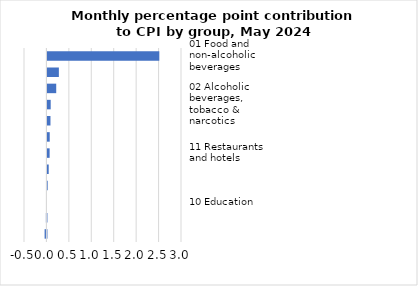
| Category |     Contributions |
|---|---|
| 01 Food and non-alcoholic beverages | 2.494 |
| 07 Transport | 0.255 |
| 05 Furnishings, household equipment & maintenance | 0.196 |
| 02 Alcoholic beverages, tobacco & narcotics | 0.073 |
| 08 Communication | 0.068 |
| 06 Health | 0.051 |
| 11 Restaurants and hotels | 0.049 |
| 09 Recreation and culture | 0.028 |
| 12 Miscellaneous goods & services | 0.006 |
| 10 Education | 0 |
| 03 Clothing and footwear | -0.013 |
| 04 Housing, water, electricity, gas & other fuels | -0.041 |